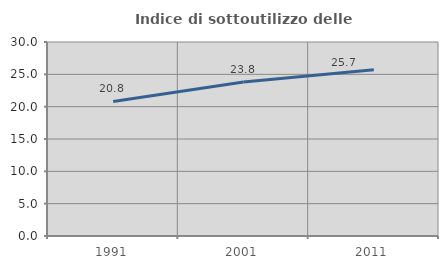
| Category | Indice di sottoutilizzo delle abitazioni  |
|---|---|
| 1991.0 | 20.808 |
| 2001.0 | 23.815 |
| 2011.0 | 25.701 |